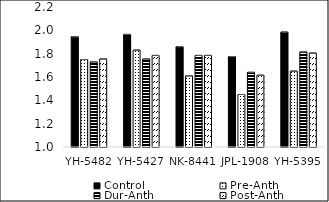
| Category | Control | Pre-Anth | Dur-Anth | Post-Anth |
|---|---|---|---|---|
| YH-5482 | 1.945 | 1.75 | 1.73 | 1.755 |
| YH-5427 | 1.965 | 1.83 | 1.755 | 1.785 |
| NK-8441 | 1.86 | 1.61 | 1.785 | 1.785 |
| JPL-1908 | 1.775 | 1.45 | 1.64 | 1.615 |
| YH-5395 | 1.985 | 1.65 | 1.815 | 1.805 |